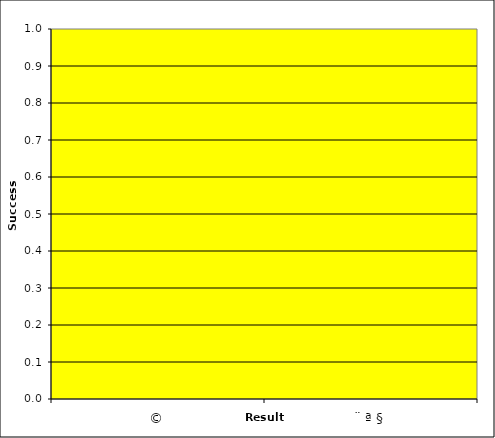
| Category | Series 0 |
|---|---|
| © | 0 |
| ¨ ª § | 0 |